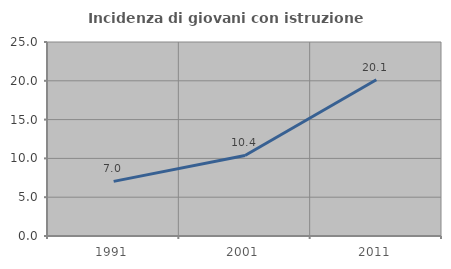
| Category | Incidenza di giovani con istruzione universitaria |
|---|---|
| 1991.0 | 7.036 |
| 2001.0 | 10.374 |
| 2011.0 | 20.138 |